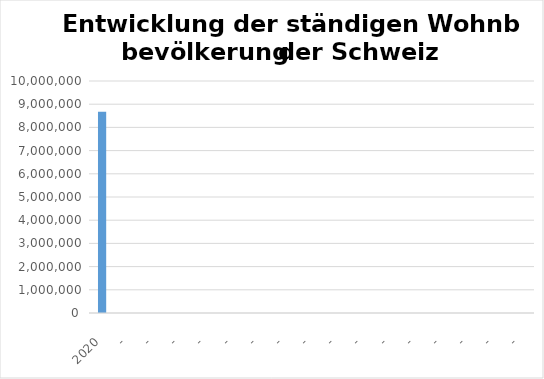
| Category | Total |
|---|---|
| 2020 | 8670300 |
| - | 0 |
| - | 0 |
| - | 0 |
| - | 0 |
| - | 0 |
| - | 0 |
| - | 0 |
| - | 0 |
| - | 0 |
| - | 0 |
| - | 0 |
| - | 0 |
| - | 0 |
| - | 0 |
| - | 0 |
| - | 0 |